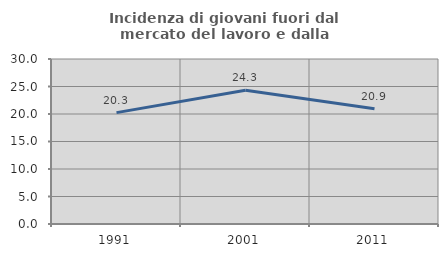
| Category | Incidenza di giovani fuori dal mercato del lavoro e dalla formazione  |
|---|---|
| 1991.0 | 20.25 |
| 2001.0 | 24.319 |
| 2011.0 | 20.939 |